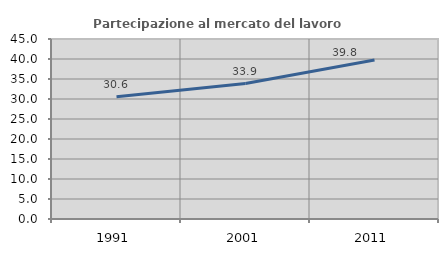
| Category | Partecipazione al mercato del lavoro  femminile |
|---|---|
| 1991.0 | 30.566 |
| 2001.0 | 33.865 |
| 2011.0 | 39.775 |